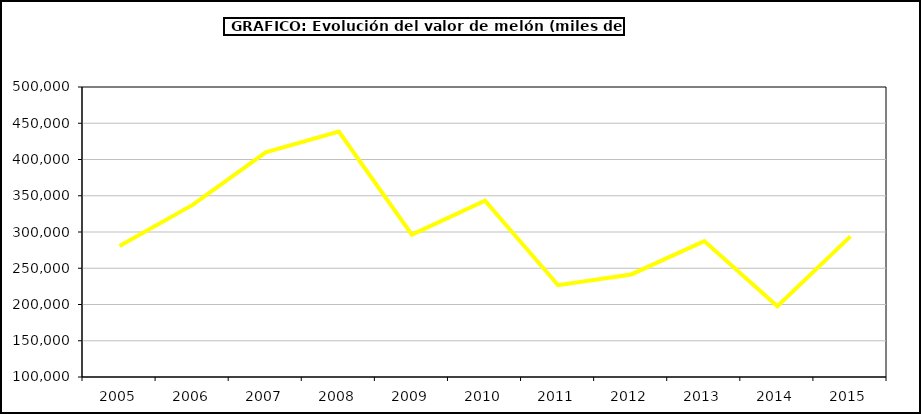
| Category | Valor |
|---|---|
| 2005.0 | 280807.931 |
| 2006.0 | 337363.062 |
| 2007.0 | 409844.546 |
| 2008.0 | 438449.843 |
| 2009.0 | 296322.107 |
| 2010.0 | 343061.749 |
| 2011.0 | 226631.76 |
| 2012.0 | 241464.672 |
| 2013.0 | 287421.365 |
| 2014.0 | 197555.814 |
| 2015.0 | 293985.4 |